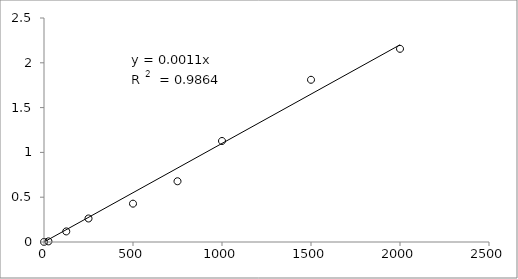
| Category | Series 0 |
|---|---|
| 2000.0 | 2.156 |
| 1500.0 | 1.81 |
| 1000.0 | 1.128 |
| 750.0 | 0.678 |
| 500.0 | 0.428 |
| 250.0 | 0.262 |
| 125.0 | 0.118 |
| 25.0 | 0.007 |
| 0.0 | 0.001 |